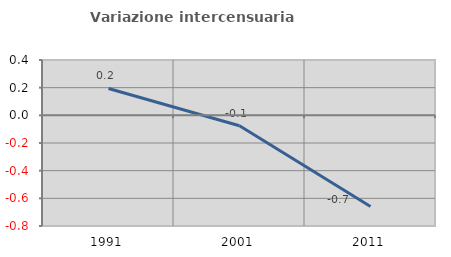
| Category | Variazione intercensuaria annua |
|---|---|
| 1991.0 | 0.194 |
| 2001.0 | -0.075 |
| 2011.0 | -0.659 |